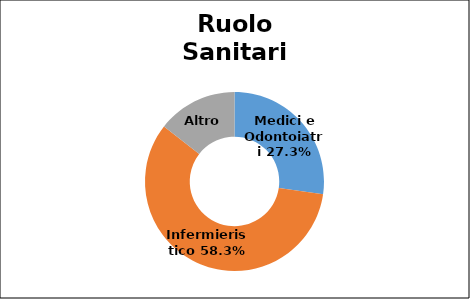
| Category | Series 0 |
|---|---|
| Medici e Odontoiatri | 0.273 |
| Infermieristico | 0.583 |
| Altro  | 0.144 |